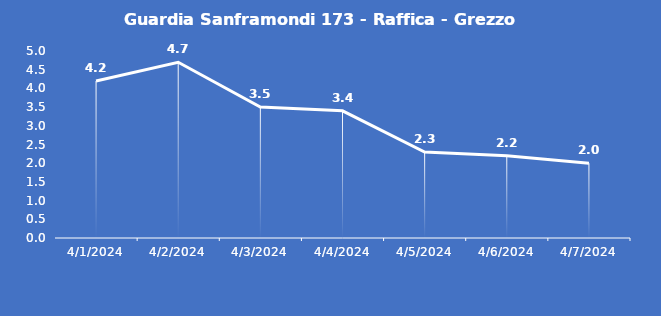
| Category | Guardia Sanframondi 173 - Raffica - Grezzo (m/s) |
|---|---|
| 4/1/24 | 4.2 |
| 4/2/24 | 4.7 |
| 4/3/24 | 3.5 |
| 4/4/24 | 3.4 |
| 4/5/24 | 2.3 |
| 4/6/24 | 2.2 |
| 4/7/24 | 2 |